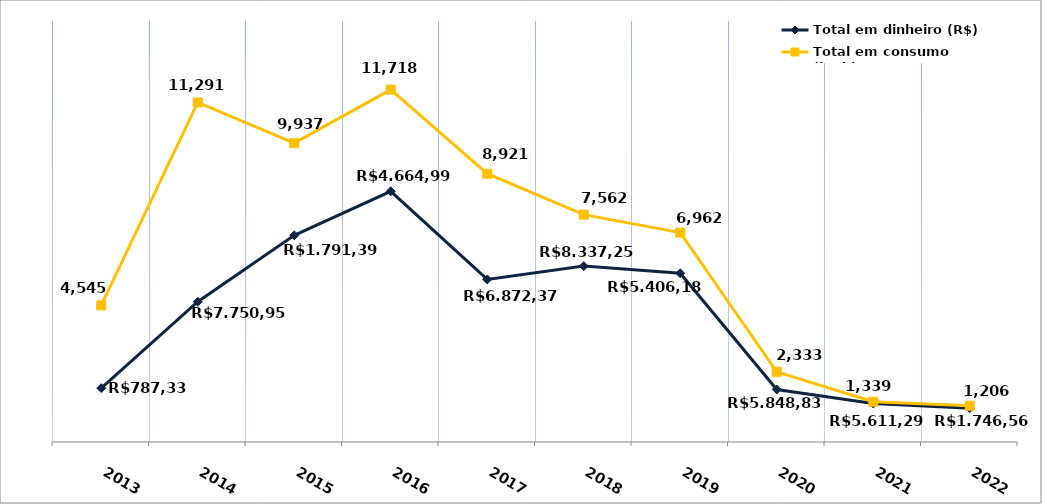
| Category | Total em dinheiro (R$) |
|---|---|
| 2013.0 | 1791.39 |
| 2014.0 | 4664.99 |
| 2015.0 | 6872.37 |
| 2016.0 | 8337.25 |
| 2017.0 | 5406.18 |
| 2018.0 | 5848.83 |
| 2019.0 | 5611.29 |
| 2020.0 | 1746.56 |
| 2021.0 | 1279.54 |
| 2022.0 | 1126.31 |